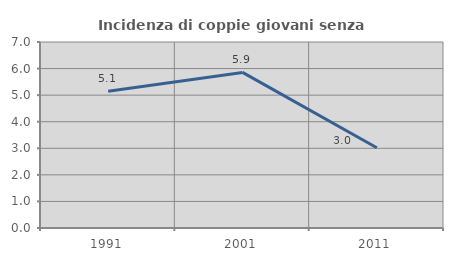
| Category | Incidenza di coppie giovani senza figli |
|---|---|
| 1991.0 | 5.145 |
| 2001.0 | 5.856 |
| 2011.0 | 3.019 |